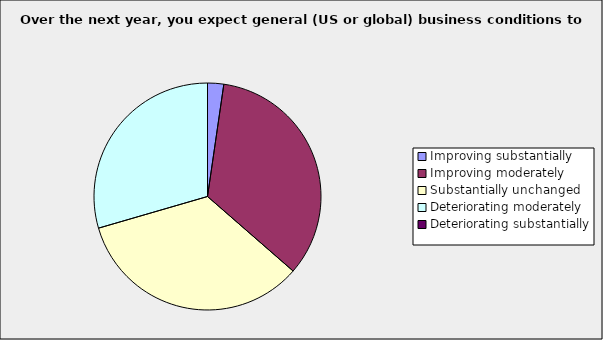
| Category | Series 0 |
|---|---|
| Improving substantially | 0.023 |
| Improving moderately | 0.341 |
| Substantially unchanged | 0.341 |
| Deteriorating moderately | 0.295 |
| Deteriorating substantially | 0 |